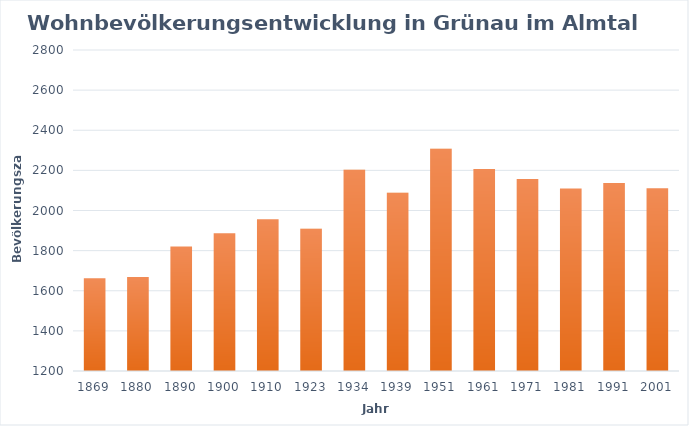
| Category | Wohnbevölkerung |
|---|---|
| 1869 | 1662 |
| 1880 | 1669 |
| 1890 | 1821 |
| 1900 | 1886 |
| 1910 | 1956 |
| 1923 | 1909 |
| 1934 | 2203 |
| 1939 | 2088 |
| 1951 | 2308 |
| 1961 | 2207 |
| 1971 | 2157 |
| 1981 | 2110 |
| 1991 | 2137 |
| 2001 | 2111 |